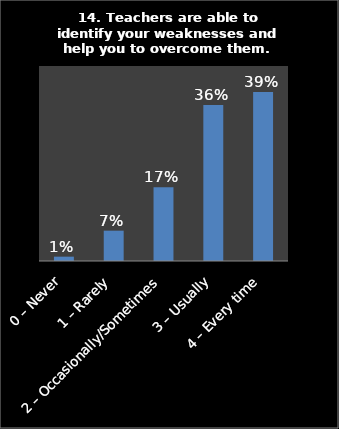
| Category | Series 0 |
|---|---|
| 0 – Never | 0.01 |
| 1 – Rarely | 0.07 |
| 2 – Occasionally/Sometimes | 0.17 |
| 3 – Usually | 0.36 |
| 4 – Every time | 0.39 |